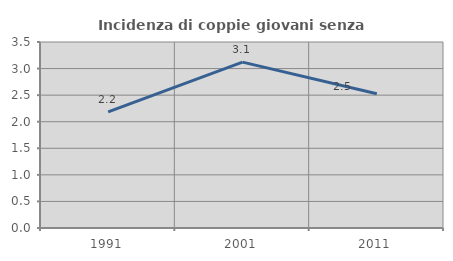
| Category | Incidenza di coppie giovani senza figli |
|---|---|
| 1991.0 | 2.185 |
| 2001.0 | 3.121 |
| 2011.0 | 2.528 |